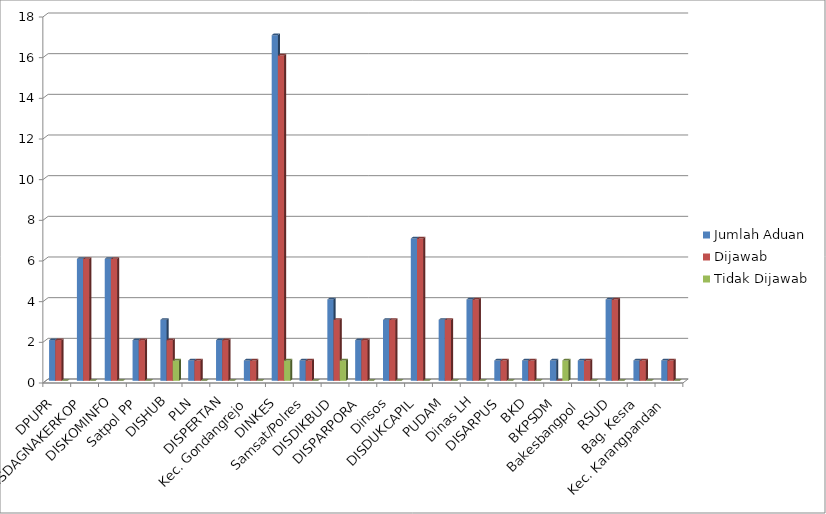
| Category | Jumlah Aduan | Dijawab | Tidak Dijawab |
|---|---|---|---|
| DPUPR | 2 | 2 | 0 |
| DISDAGNAKERKOP | 6 | 6 | 0 |
| DISKOMINFO | 6 | 6 | 0 |
| Satpol PP | 2 | 2 | 0 |
| DISHUB | 3 | 2 | 1 |
| PLN | 1 | 1 | 0 |
| DISPERTAN | 2 | 2 | 0 |
| Kec. Gondangrejo | 1 | 1 | 0 |
| DINKES | 17 | 16 | 1 |
| Samsat/Polres  | 1 | 1 | 0 |
| DISDIKBUD | 4 | 3 | 1 |
| DISPARPORA | 2 | 2 | 0 |
| Dinsos | 3 | 3 | 0 |
| DISDUKCAPIL | 7 | 7 | 0 |
| PUDAM | 3 | 3 | 0 |
| Dinas LH | 4 | 4 | 0 |
| DISARPUS | 1 | 1 | 0 |
| BKD | 1 | 1 | 0 |
| BKPSDM | 1 | 0 | 1 |
| Bakesbangpol  | 1 | 1 | 0 |
| RSUD | 4 | 4 | 0 |
| Bag. Kesra | 1 | 1 | 0 |
| Kec. Karangpandan | 1 | 1 | 0 |